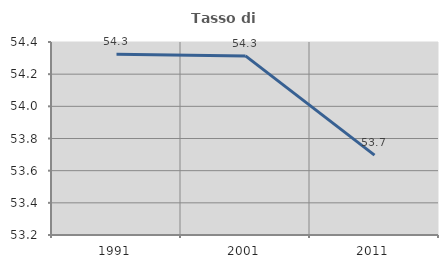
| Category | Tasso di occupazione   |
|---|---|
| 1991.0 | 54.323 |
| 2001.0 | 54.314 |
| 2011.0 | 53.696 |